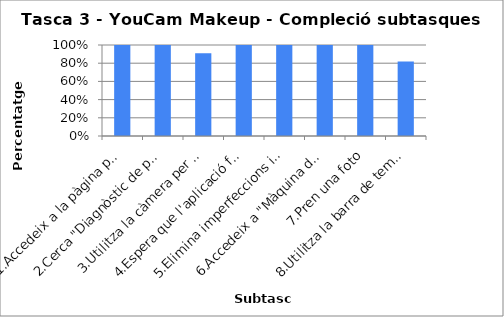
| Category | Series 0 |
|---|---|
| 1.Accedeix a la pàgina principal | 1 |
| 2.Cerca "Diagnòstic de pell" | 1 |
| 3.Utilitza la càmera per capturar imatge del rostre | 0.91 |
| 4.Espera que l'aplicació faci el diagnòstic | 1 |
| 5.Elimina imperfeccions indicades pel sistema | 1 |
| 6.Accedeix a "Màquina del temps" | 1 |
| 7.Pren una foto | 1 |
| 8.Utilitza la barra de temps | 0.82 |